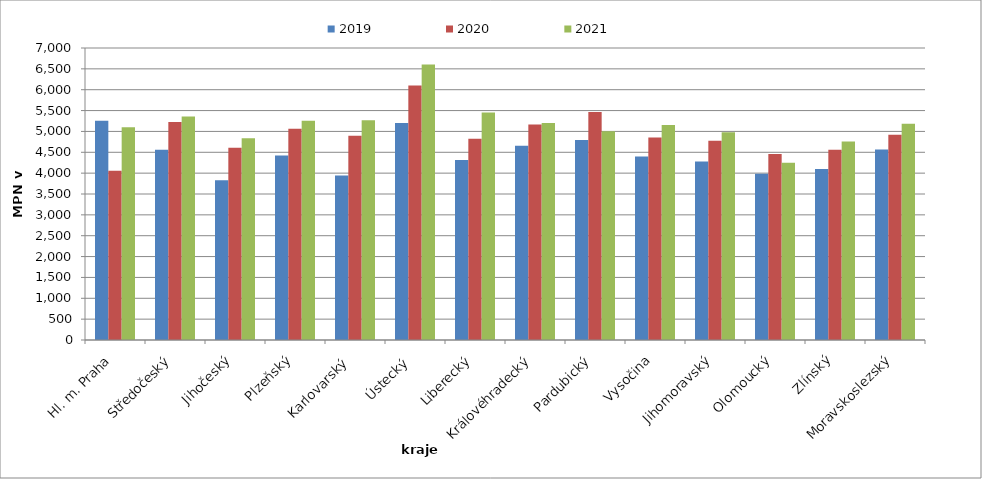
| Category | 2019 | 2020 | 2021 |
|---|---|---|---|
| Hl. m. Praha | 5256 | 4057 | 5103 |
| Středočeský | 4562 | 5226 | 5358 |
| Jihočeský | 3831 | 4611 | 4837 |
| Plzeňský | 4425 | 5063 | 5258 |
| Karlovarský  | 3945 | 4899 | 5267 |
| Ústecký   | 5205 | 6102 | 6602 |
| Liberecký | 4318 | 4827 | 5453 |
| Královéhradecký | 4655 | 5167 | 5200 |
| Pardubický | 4792 | 5463 | 5002 |
| Vysočina | 4401 | 4855 | 5153 |
| Jihomoravský | 4281 | 4774 | 4981 |
| Olomoucký | 3987 | 4458 | 4252 |
| Zlínský | 4099 | 4559 | 4760 |
| Moravskoslezský | 4566 | 4919 | 5182 |